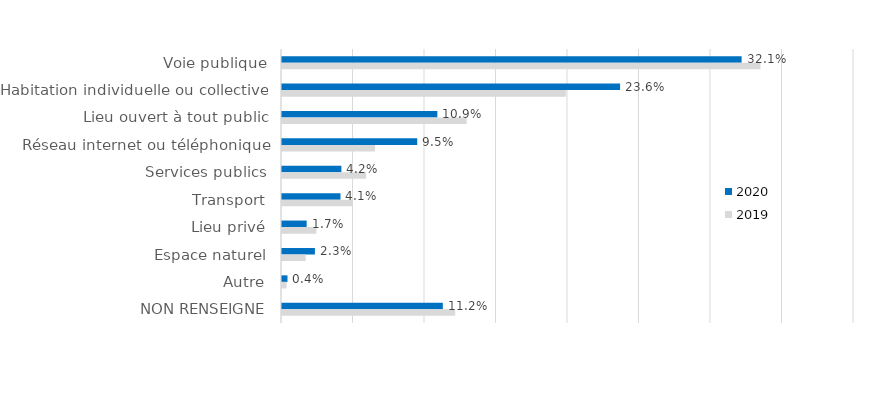
| Category | 2020 | 2019 |
|---|---|---|
| Voie publique | 0.321 | 0.335 |
| Habitation individuelle ou collective | 0.236 | 0.199 |
| Lieu ouvert à tout public | 0.109 | 0.129 |
| Réseau internet ou téléphonique | 0.095 | 0.065 |
| Services publics | 0.042 | 0.059 |
| Transport | 0.041 | 0.049 |
| Lieu privé | 0.017 | 0.024 |
| Espace naturel | 0.023 | 0.017 |
| Autre | 0.004 | 0.003 |
| NON RENSEIGNE | 0.112 | 0.121 |